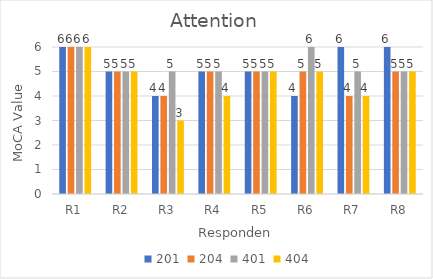
| Category | 201 | 204 | 401 | 404 |
|---|---|---|---|---|
| R1 | 6 | 6 | 6 | 6 |
| R2 | 5 | 5 | 5 | 5 |
| R3 | 4 | 4 | 5 | 3 |
| R4 | 5 | 5 | 5 | 4 |
| R5 | 5 | 5 | 5 | 5 |
| R6 | 4 | 5 | 6 | 5 |
| R7 | 6 | 4 | 5 | 4 |
| R8 | 6 | 5 | 5 | 5 |